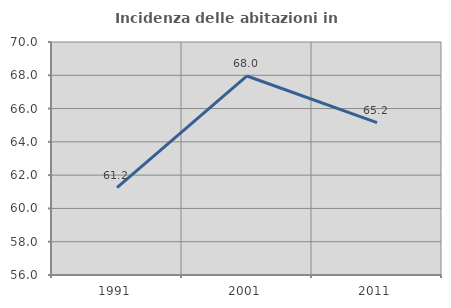
| Category | Incidenza delle abitazioni in proprietà  |
|---|---|
| 1991.0 | 61.247 |
| 2001.0 | 67.958 |
| 2011.0 | 65.158 |